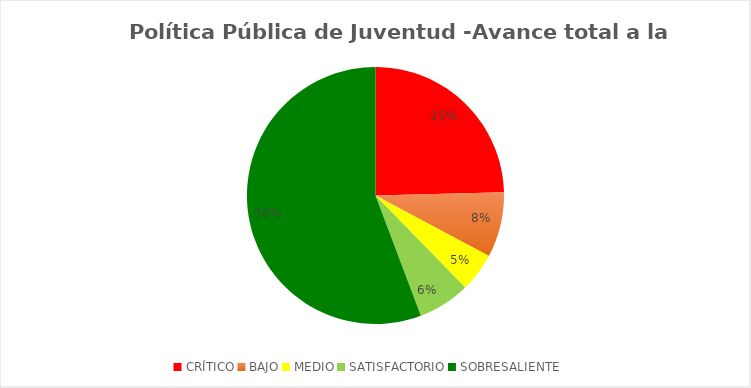
| Category | Series 0 |
|---|---|
| CRÍTICO | 15 |
| BAJO | 5 |
| MEDIO | 3 |
| SATISFACTORIO | 4 |
| SOBRESALIENTE | 34 |